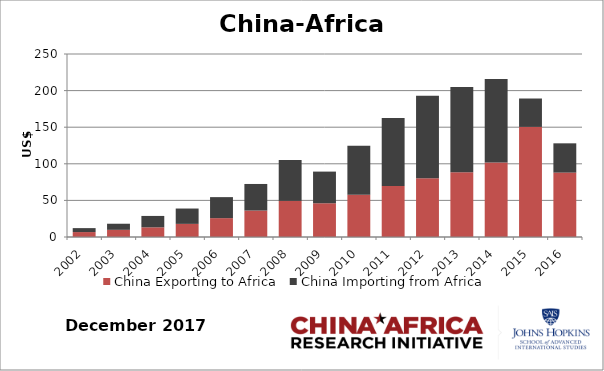
| Category | China Exporting to Africa | China Importing from Africa |
|---|---|---|
| 2002.0 | 6.736 | 5.397 |
| 2003.0 | 9.803 | 8.326 |
| 2004.0 | 13.22 | 15.564 |
| 2005.0 | 17.931 | 20.966 |
| 2006.0 | 25.781 | 28.691 |
| 2007.0 | 36.145 | 36.306 |
| 2008.0 | 49.341 | 55.873 |
| 2009.0 | 46.101 | 43.25 |
| 2010.0 | 57.875 | 66.943 |
| 2011.0 | 69.809 | 92.87 |
| 2012.0 | 80.343 | 112.601 |
| 2013.0 | 88.625 | 116.251 |
| 2014.0 | 101.699 | 114.206 |
| 2015.0 | 150.387 | 38.81 |
| 2016.0 | 88.005 | 39.963 |